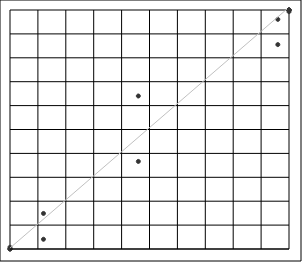
| Category | Series 0 |
|---|---|
| 0.0 | 0 |
| 0.0 | 0.006 |
| 0.0 | 0.084 |
| 0.0 | 0.73 |
| 12.0 | 4.075 |
| 12.0 | 14.878 |
| 46.0 | 36.64 |
| 46.0 | 64.017 |
| 96.0 | 85.525 |
| 96.0 | 96.075 |
| 100.0 | 99.305 |
| 100.0 | 99.921 |
| 100.0 | 99.994 |
| 100.0 | 100 |
| 100.0 | 100 |
| 100.0 | 100 |